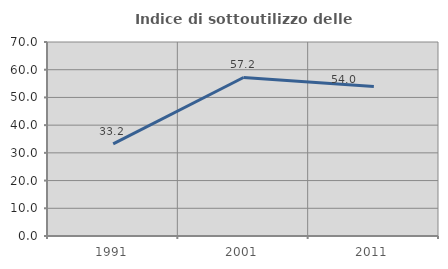
| Category | Indice di sottoutilizzo delle abitazioni  |
|---|---|
| 1991.0 | 33.217 |
| 2001.0 | 57.194 |
| 2011.0 | 53.962 |